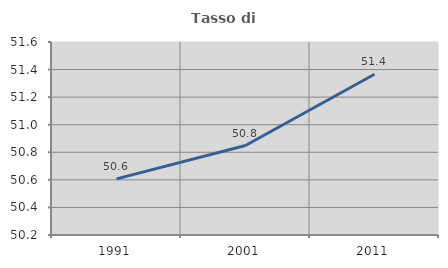
| Category | Tasso di occupazione   |
|---|---|
| 1991.0 | 50.607 |
| 2001.0 | 50.849 |
| 2011.0 | 51.366 |